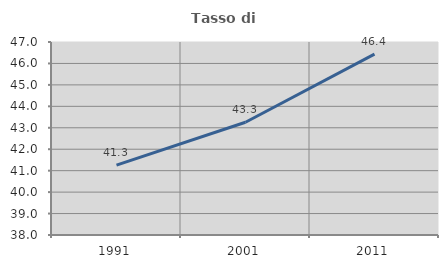
| Category | Tasso di occupazione   |
|---|---|
| 1991.0 | 41.261 |
| 2001.0 | 43.26 |
| 2011.0 | 46.434 |